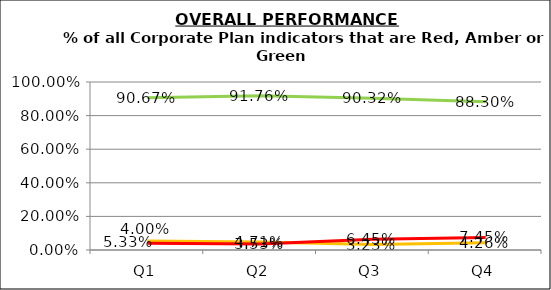
| Category | Green | Amber | Red |
|---|---|---|---|
| Q1 | 0.907 | 0.053 | 0.04 |
| Q2 | 0.918 | 0.047 | 0.035 |
| Q3 | 0.903 | 0.032 | 0.065 |
| Q4 | 0.883 | 0.043 | 0.074 |